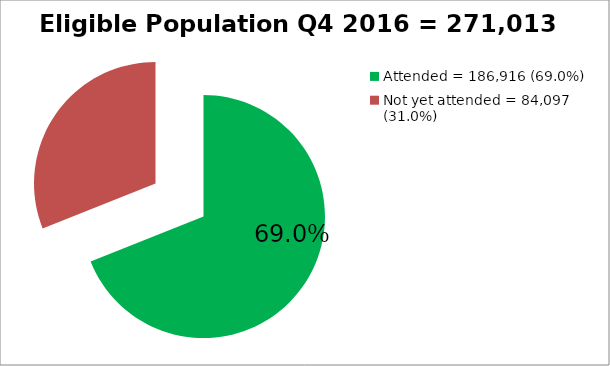
| Category | Eligible Population Q4 2016= 271,013 |
|---|---|
| Attended = 186,916 (69.0%) | 186916 |
| Not yet attended = 84,097 (31.0%)  | 84097 |